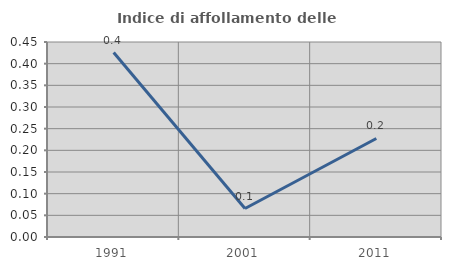
| Category | Indice di affollamento delle abitazioni  |
|---|---|
| 1991.0 | 0.426 |
| 2001.0 | 0.066 |
| 2011.0 | 0.227 |